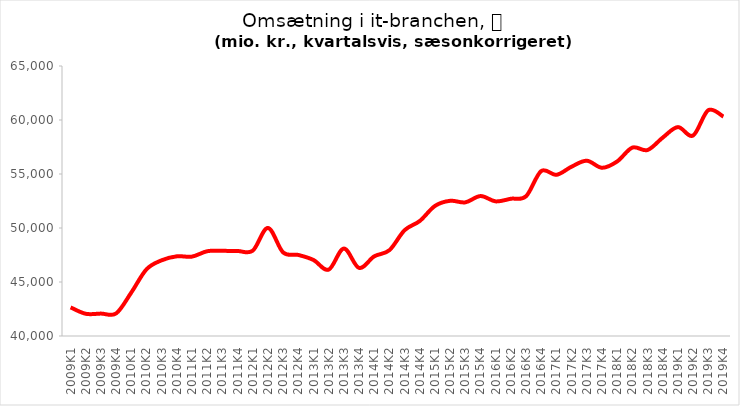
| Category | Series 0 |
|---|---|
| 2009K1 | 42648.844 |
| 2009K2 | 42055.748 |
| 2009K3 | 42075.7 |
| 2009K4 | 42092.495 |
| 2010K1 | 44028.954 |
| 2010K2 | 46175.814 |
| 2010K3 | 47010.294 |
| 2010K4 | 47379.29 |
| 2011K1 | 47351.875 |
| 2011K2 | 47850.62 |
| 2011K3 | 47883.373 |
| 2011K4 | 47870.826 |
| 2012K1 | 47902.831 |
| 2012K2 | 50004.854 |
| 2012K3 | 47737.836 |
| 2012K4 | 47504.081 |
| 2013K1 | 47037.057 |
| 2013K2 | 46145.781 |
| 2013K3 | 48096.131 |
| 2013K4 | 46305.486 |
| 2014K1 | 47375.821 |
| 2014K2 | 47945.93 |
| 2014K3 | 49795.425 |
| 2014K4 | 50649.775 |
| 2015K1 | 52041.467 |
| 2015K2 | 52520.757 |
| 2015K3 | 52374.399 |
| 2015K4 | 52958.457 |
| 2016K1 | 52465.319 |
| 2016K2 | 52709.193 |
| 2016K3 | 52938.799 |
| 2016K4 | 55272.513 |
| 2017K1 | 54922.814 |
| 2017K2 | 55679.453 |
| 2017K3 | 56230.301 |
| 2017K4 | 55578.316 |
| 2018K1 | 56158.307 |
| 2018K2 | 57443.385 |
| 2018K3 | 57219.066 |
| 2018K4 | 58365.843 |
| 2019K1 | 59342.493 |
| 2019K2 | 58560.94 |
| 2019K3 | 60903.774 |
| 2019K4 | 60317.705 |